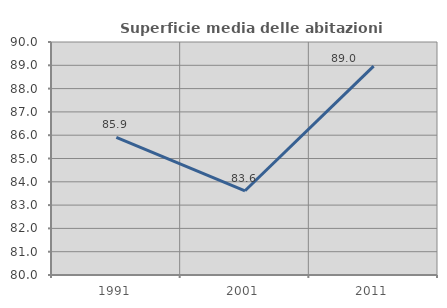
| Category | Superficie media delle abitazioni occupate |
|---|---|
| 1991.0 | 85.91 |
| 2001.0 | 83.615 |
| 2011.0 | 88.967 |